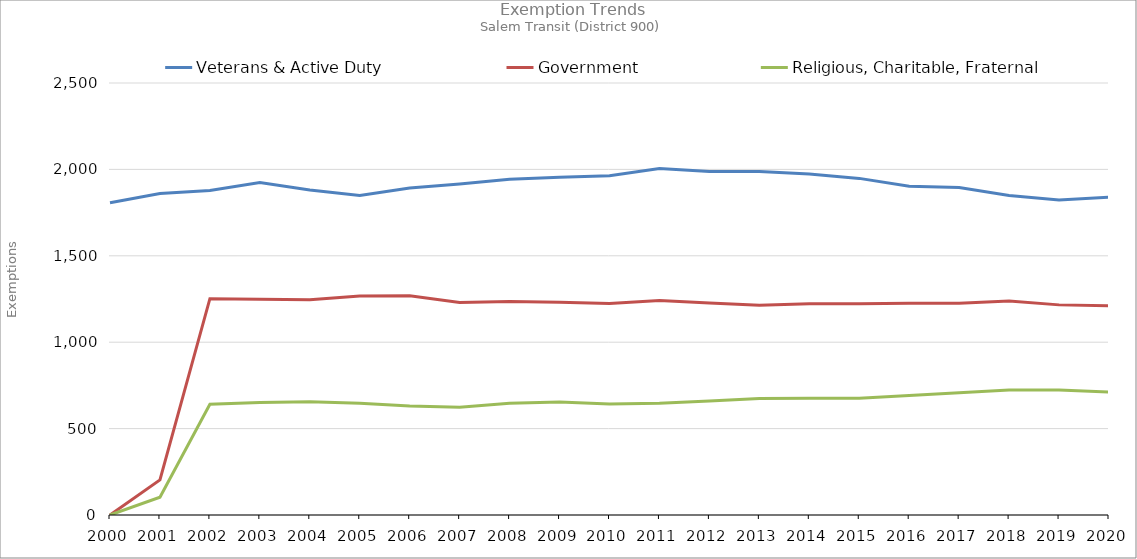
| Category | Veterans & Active Duty | Government | Religious, Charitable, Fraternal |
|---|---|---|---|
| 2000.0 | 1807 | 0 | 0 |
| 2001.0 | 1860 | 203 | 103 |
| 2002.0 | 1878 | 1252 | 641 |
| 2003.0 | 1924 | 1248 | 651 |
| 2004.0 | 1881 | 1245 | 655 |
| 2005.0 | 1849 | 1268 | 647 |
| 2006.0 | 1892 | 1269 | 631 |
| 2007.0 | 1915 | 1230 | 623 |
| 2008.0 | 1943 | 1236 | 646 |
| 2009.0 | 1954 | 1231 | 654 |
| 2010.0 | 1963 | 1224 | 643 |
| 2011.0 | 2005 | 1242 | 647 |
| 2012.0 | 1988 | 1227 | 660 |
| 2013.0 | 1988 | 1214 | 674 |
| 2014.0 | 1974 | 1222 | 675 |
| 2015.0 | 1948 | 1223 | 675 |
| 2016.0 | 1903 | 1225 | 691 |
| 2017.0 | 1895 | 1226 | 707 |
| 2018.0 | 1849 | 1239 | 724 |
| 2019.0 | 1823 | 1216 | 723 |
| 2020.0 | 1839 | 1211 | 711 |